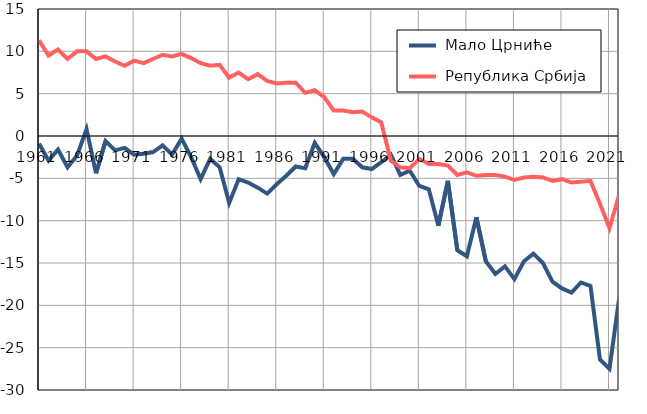
| Category |  Мало Црниће |  Република Србија |
|---|---|---|
| 1961.0 | -0.9 | 11.3 |
| 1962.0 | -2.9 | 9.5 |
| 1963.0 | -1.6 | 10.2 |
| 1964.0 | -3.7 | 9.1 |
| 1965.0 | -2.3 | 10 |
| 1966.0 | 0.8 | 10 |
| 1967.0 | -4.4 | 9.1 |
| 1968.0 | -0.6 | 9.4 |
| 1969.0 | -1.7 | 8.8 |
| 1970.0 | -1.4 | 8.3 |
| 1971.0 | -2.2 | 8.9 |
| 1972.0 | -2.1 | 8.6 |
| 1973.0 | -1.9 | 9.1 |
| 1974.0 | -1.1 | 9.6 |
| 1975.0 | -2.2 | 9.4 |
| 1976.0 | -0.3 | 9.7 |
| 1977.0 | -2.5 | 9.2 |
| 1978.0 | -5.1 | 8.6 |
| 1979.0 | -2.7 | 8.3 |
| 1980.0 | -3.7 | 8.4 |
| 1981.0 | -7.9 | 6.9 |
| 1982.0 | -5.1 | 7.5 |
| 1983.0 | -5.5 | 6.7 |
| 1984.0 | -6.1 | 7.3 |
| 1985.0 | -6.8 | 6.5 |
| 1986.0 | -5.7 | 6.2 |
| 1987.0 | -4.7 | 6.3 |
| 1988.0 | -3.6 | 6.3 |
| 1989.0 | -3.8 | 5.1 |
| 1990.0 | -0.8 | 5.4 |
| 1991.0 | -2.5 | 4.6 |
| 1992.0 | -4.5 | 3 |
| 1993.0 | -2.7 | 3 |
| 1994.0 | -2.7 | 2.8 |
| 1995.0 | -3.7 | 2.9 |
| 1996.0 | -3.9 | 2.2 |
| 1997.0 | -3.1 | 1.6 |
| 1998.0 | -2.2 | -2.9 |
| 1999.0 | -4.6 | -3.7 |
| 2000.0 | -4.1 | -3.8 |
| 2001.0 | -5.9 | -2.7 |
| 2002.0 | -6.3 | -3.3 |
| 2003.0 | -10.6 | -3.3 |
| 2004.0 | -5.3 | -3.5 |
| 2005.0 | -13.5 | -4.6 |
| 2006.0 | -14.2 | -4.3 |
| 2007.0 | -9.6 | -4.7 |
| 2008.0 | -14.8 | -4.6 |
| 2009.0 | -16.3 | -4.6 |
| 2010.0 | -15.4 | -4.8 |
| 2011.0 | -16.9 | -5.2 |
| 2012.0 | -14.8 | -4.9 |
| 2013.0 | -13.9 | -4.8 |
| 2014.0 | -15 | -4.9 |
| 2015.0 | -17.2 | -5.3 |
| 2016.0 | -18 | -5.1 |
| 2017.0 | -18.5 | -5.5 |
| 2018.0 | -17.3 | -5.4 |
| 2019.0 | -17.7 | -5.3 |
| 2020.0 | -26.4 | -8 |
| 2021.0 | -27.5 | -10.9 |
| 2022.0 | -19.3 | -7 |